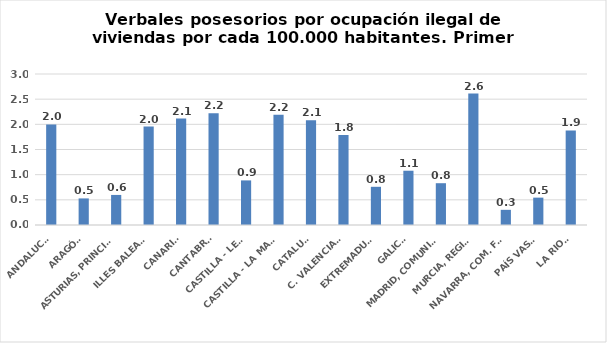
| Category | Series 0 |
|---|---|
| ANDALUCÍA | 1.997 |
| ARAGÓN | 0.528 |
| ASTURIAS, PRINCIPADO | 0.597 |
| ILLES BALEARS | 1.955 |
| CANARIAS | 2.114 |
| CANTABRIA | 2.221 |
| CASTILLA - LEÓN | 0.886 |
| CASTILLA - LA MANCHA | 2.193 |
| CATALUÑA | 2.081 |
| C. VALENCIANA | 1.788 |
| EXTREMADURA | 0.759 |
| GALICIA | 1.078 |
| MADRID, COMUNIDAD | 0.83 |
| MURCIA, REGIÓN | 2.612 |
| NAVARRA, COM. FORAL | 0.301 |
| PAÍS VASCO | 0.544 |
| LA RIOJA | 1.878 |